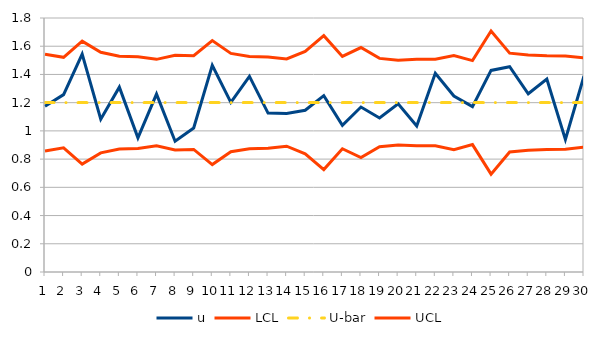
| Category | u | LCL | U-bar | UCL |
|---|---|---|---|---|
| 0 | 1.174 | 0.858 | 1.2 | 1.543 |
| 1 | 1.257 | 0.88 | 1.2 | 1.521 |
| 2 | 1.544 | 0.765 | 1.2 | 1.636 |
| 3 | 1.082 | 0.844 | 1.2 | 1.557 |
| 4 | 1.31 | 0.872 | 1.2 | 1.529 |
| 5 | 0.951 | 0.875 | 1.2 | 1.526 |
| 6 | 1.261 | 0.894 | 1.2 | 1.507 |
| 7 | 0.927 | 0.865 | 1.2 | 1.536 |
| 8 | 1.02 | 0.868 | 1.2 | 1.533 |
| 9 | 1.464 | 0.761 | 1.2 | 1.64 |
| 10 | 1.202 | 0.852 | 1.2 | 1.549 |
| 11 | 1.386 | 0.873 | 1.2 | 1.528 |
| 12 | 1.126 | 0.877 | 1.2 | 1.524 |
| 13 | 1.124 | 0.891 | 1.2 | 1.51 |
| 14 | 1.146 | 0.838 | 1.2 | 1.563 |
| 15 | 1.25 | 0.726 | 1.2 | 1.675 |
| 16 | 1.04 | 0.873 | 1.2 | 1.528 |
| 17 | 1.169 | 0.81 | 1.2 | 1.591 |
| 18 | 1.091 | 0.887 | 1.2 | 1.514 |
| 19 | 1.192 | 0.9 | 1.2 | 1.501 |
| 20 | 1.035 | 0.894 | 1.2 | 1.507 |
| 21 | 1.409 | 0.894 | 1.2 | 1.507 |
| 22 | 1.247 | 0.867 | 1.2 | 1.534 |
| 23 | 1.172 | 0.903 | 1.2 | 1.498 |
| 24 | 1.429 | 0.693 | 1.2 | 1.708 |
| 25 | 1.455 | 0.85 | 1.2 | 1.551 |
| 26 | 1.263 | 0.863 | 1.2 | 1.538 |
| 27 | 1.367 | 0.868 | 1.2 | 1.533 |
| 28 | 0.939 | 0.87 | 1.2 | 1.531 |
| 29 | 1.389 | 0.884 | 1.2 | 1.517 |